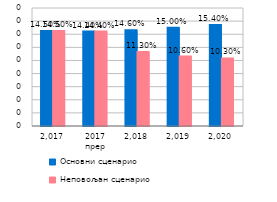
| Category | Основни сценарио | Неповољан сценарио |
|---|---|---|
| 2.017 | 0.145 | 0.145 |
| 2017 прер | 0.144 | 0.144 |
| 2.018 | 0.146 | 0.113 |
| 2.019 | 0.15 | 0.106 |
| 2.020 | 0.154 | 0.103 |